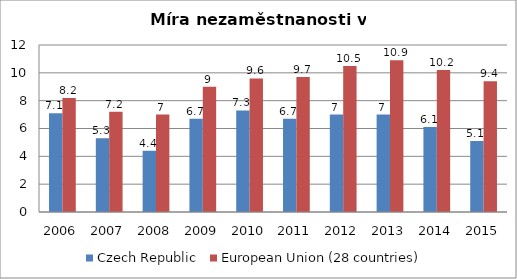
| Category | Czech Republic | European Union (28 countries) |
|---|---|---|
| 2006 | 7.1 | 8.2 |
| 2007 | 5.3 | 7.2 |
| 2008 | 4.4 | 7 |
| 2009 | 6.7 | 9 |
| 2010 | 7.3 | 9.6 |
| 2011 | 6.7 | 9.7 |
| 2012 | 7 | 10.5 |
| 2013 | 7 | 10.9 |
| 2014 | 6.1 | 10.2 |
| 2015 | 5.1 | 9.4 |